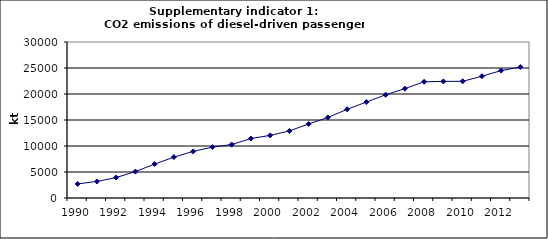
| Category | CO2 emissions of diesel-driven passenger cars, kt |
|---|---|
| 1990 | 2708.953 |
| 1991 | 3183.608 |
| 1992 | 3925.978 |
| 1993 | 5082.366 |
| 1994 | 6522.799 |
| 1995 | 7862.25 |
| 1996 | 8959.13 |
| 1997 | 9791.003 |
| 1998 | 10273.1 |
| 1999 | 11436.504 |
| 2000 | 12043.241 |
| 2001 | 12894.404 |
| 2002 | 14233.802 |
| 2003 | 15481.207 |
| 2004 | 17057.054 |
| 2005 | 18445.58 |
| 2006 | 19850.267 |
| 2007 | 21030.921 |
| 2008 | 22350.086 |
| 2009 | 22420.374 |
| 2010 | 22439.426 |
| 2011 | 23424.638 |
| 2012 | 24502.609 |
| 2013 | 25172.396 |